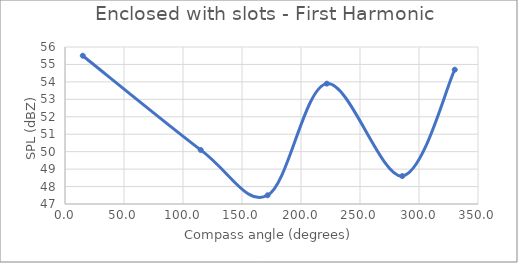
| Category | Series 0 |
|---|---|
| 15.06445125542554 | 55.5 |
| 115.00449447818254 | 50.1 |
| 171.7068171198818 | 47.5 |
| 221.8691292075067 | 53.9 |
| 285.7828166838848 | 48.6 |
| 330.28010595813004 | 54.7 |